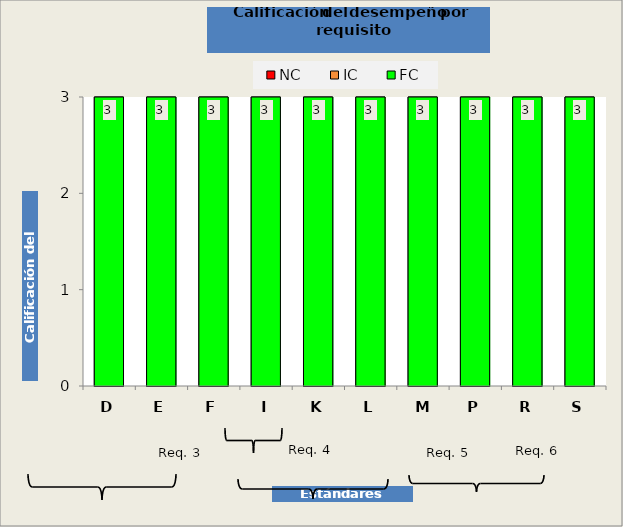
| Category | Calificación del desempeño | NC | IC | FC |
|---|---|---|---|---|
| D | 3 | 0 | 0 | 3 |
| E | 3 | 0 | 0 | 3 |
| F | 3 | 0 | 0 | 3 |
| I | 3 | 0 | 0 | 3 |
| K | 3 | 0 | 0 | 3 |
| L | 3 | 0 | 0 | 3 |
| M | 3 | 0 | 0 | 3 |
| P | 3 | 0 | 0 | 3 |
| R | 3 | 0 | 0 | 3 |
| S | 3 | 0 | 0 | 3 |